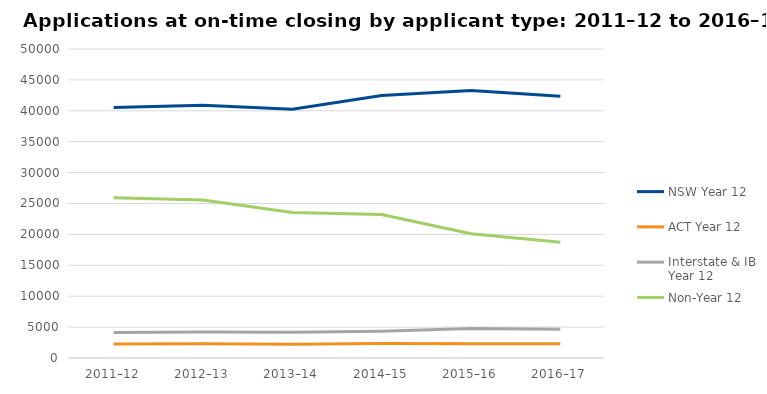
| Category | NSW Year 12 | ACT Year 12 | Interstate & IB Year 12 | Non-Year 12 |
|---|---|---|---|---|
| 2011–12 | 40535 | 2280 | 4137 | 25949 |
| 2012–13 | 40895 | 2308 | 4195 | 25567 |
| 2013–14 | 40264 | 2216 | 4168 | 23542 |
| 2014–15 | 42458 | 2365 | 4318 | 23202 |
| 2015–16 | 43303 | 2288 | 4783 | 20115 |
| 2016–17 | 42339 | 2306 | 4670 | 18727 |